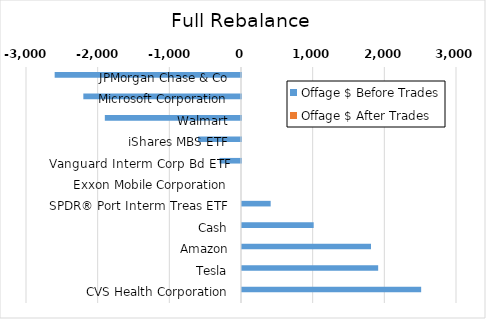
| Category | Offage $ Before Trades | Offage $ After Trades |
|---|---|---|
| JPMorgan Chase & Co | -2600 | 0 |
| Microsoft Corporation | -2200 | 0 |
| Walmart | -1900 | 0 |
| iShares MBS ETF | -600 | 0 |
| Vanguard Interm Corp Bd ETF | -300 | 0 |
| Exxon Mobile Corporation | 0 | 0 |
| SPDR® Port Interm Treas ETF | 400 | 0 |
| Cash | 1000 | 0 |
| Amazon | 1800 | 0 |
| Tesla | 1900 | 0 |
| CVS Health Corporation | 2500 | 0 |